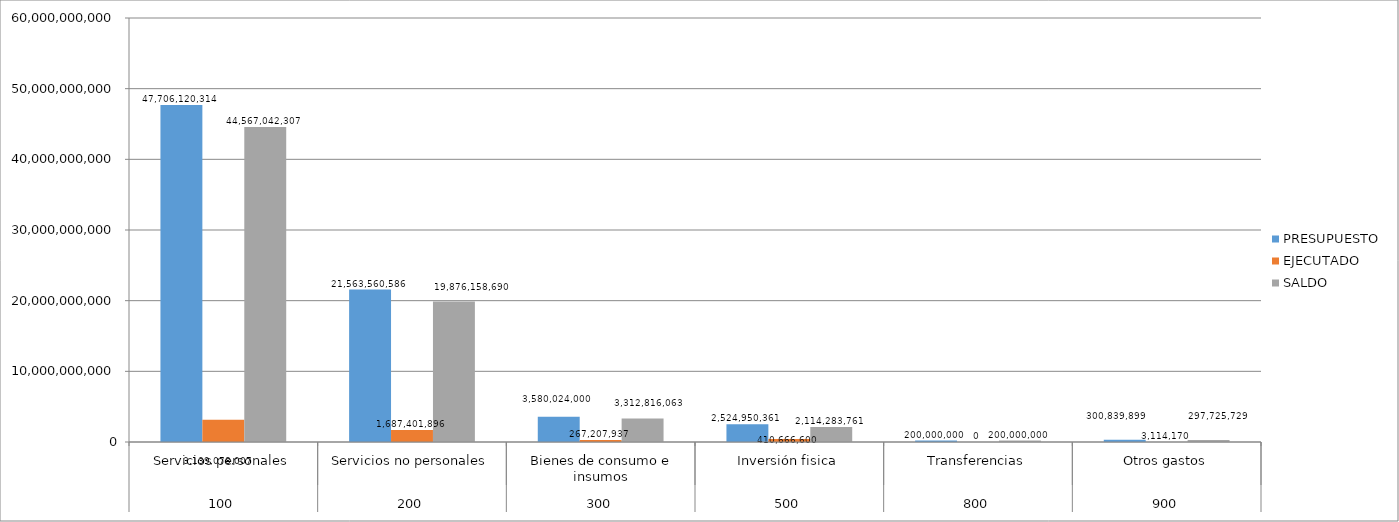
| Category | PRESUPUESTO | EJECUTADO | SALDO |
|---|---|---|---|
| 0 | 47706120314 | 3139078007 | 44567042307 |
| 1 | 21563560586 | 1687401896 | 19876158690 |
| 2 | 3580024000 | 267207937 | 3312816063 |
| 3 | 2524950361 | 410666600 | 2114283761 |
| 4 | 200000000 | 0 | 200000000 |
| 5 | 300839899 | 3114170 | 297725729 |